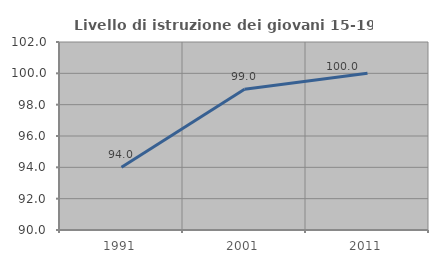
| Category | Livello di istruzione dei giovani 15-19 anni |
|---|---|
| 1991.0 | 94 |
| 2001.0 | 98.99 |
| 2011.0 | 100 |